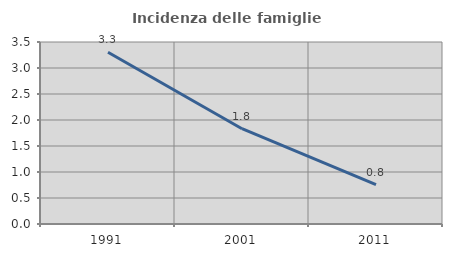
| Category | Incidenza delle famiglie numerose |
|---|---|
| 1991.0 | 3.302 |
| 2001.0 | 1.833 |
| 2011.0 | 0.757 |